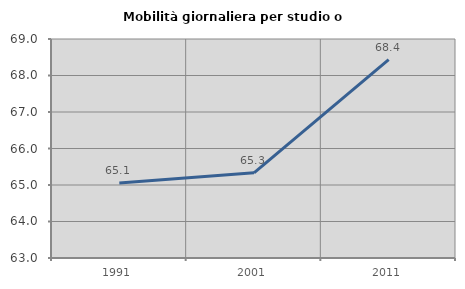
| Category | Mobilità giornaliera per studio o lavoro |
|---|---|
| 1991.0 | 65.056 |
| 2001.0 | 65.332 |
| 2011.0 | 68.433 |